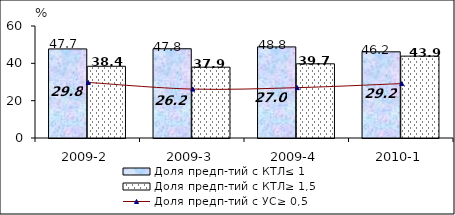
| Category | Доля предп-тий с КТЛ≤ 1 | Доля предп-тий с КТЛ≥ 1,5 |
|---|---|---|
| 2009-2 | 47.722 | 38.426 |
| 2009-3 | 47.811 | 37.935 |
| 2009-4 | 48.803 | 39.749 |
| 2010-1 | 46.171 | 43.856 |